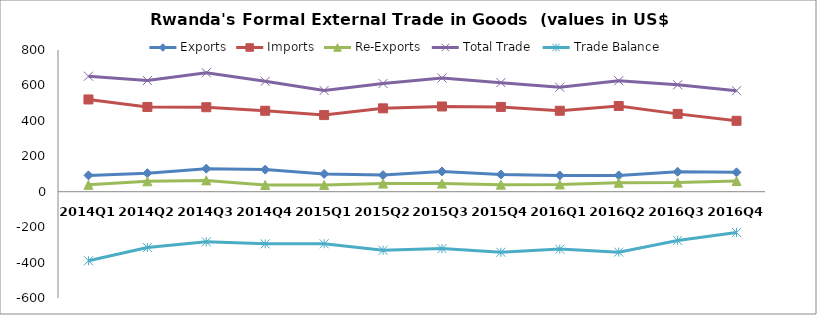
| Category | Exports | Imports | Re-Exports | Total Trade | Trade Balance |
|---|---|---|---|---|---|
| 2014Q1 | 92.155 | 520.838 | 39.039 | 652.033 | -389.643 |
| 2014Q2 | 104.739 | 478.379 | 58.742 | 627.5 | -314.898 |
| 2014Q3 | 129.946 | 476.955 | 63.929 | 671.52 | -283.08 |
| 2014Q4 | 124.747 | 457.048 | 38.092 | 623.245 | -294.209 |
| 2015Q1 | 100.645 | 432.606 | 38.092 | 571.343 | -293.87 |
| 2015Q2 | 93.892 | 470.703 | 46.126 | 610.721 | -330.685 |
| 2015Q3 | 114.24 | 481.145 | 46.053 | 641.438 | -320.853 |
| 2015Q4 | 97.026 | 478.754 | 39.897 | 615.677 | -341.831 |
| 2016Q1 | 91.795 | 456.929 | 41.031 | 589.755 | -324.103 |
| 2016Q2 | 92.237 | 483.863 | 50.433 | 626.533 | -341.192 |
| 2016Q3 | 112.536 | 439.389 | 51.515 | 603.44 | -275.338 |
| 2016Q4 | 109.503 | 400.306 | 60.303 | 570.112 | -230.5 |